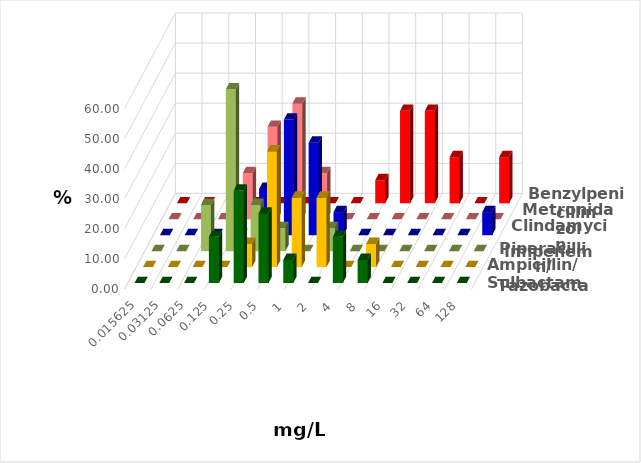
| Category | Ampicillin/ Sulbactam | Piperacillin/ Tazobactam | Imipenem | Clindamycin | Metronidazol | Benzylpenicillin |
|---|---|---|---|---|---|---|
| 0.015625 | 0 | 0 | 0 | 0 | 0 | 0 |
| 0.03125 | 0 | 0 | 0 | 0 | 0 | 0 |
| 0.0625 | 0 | 0 | 15.385 | 0 | 0 | 0 |
| 0.125 | 15.385 | 0 | 53.846 | 0 | 15.385 | 0 |
| 0.25 | 30.769 | 7.692 | 15.385 | 15.385 | 30.769 | 0 |
| 0.5 | 23.077 | 38.462 | 7.692 | 38.462 | 38.462 | 0 |
| 1.0 | 7.692 | 23.077 | 0 | 30.769 | 15.385 | 0 |
| 2.0 | 0 | 23.077 | 7.692 | 7.692 | 0 | 0 |
| 4.0 | 15.385 | 0 | 0 | 0 | 0 | 7.692 |
| 8.0 | 7.692 | 7.692 | 0 | 0 | 0 | 30.769 |
| 16.0 | 0 | 0 | 0 | 0 | 0 | 30.769 |
| 32.0 | 0 | 0 | 0 | 0 | 0 | 15.385 |
| 64.0 | 0 | 0 | 0 | 0 | 0 | 0 |
| 128.0 | 0 | 0 | 0 | 7.692 | 0 | 15.385 |